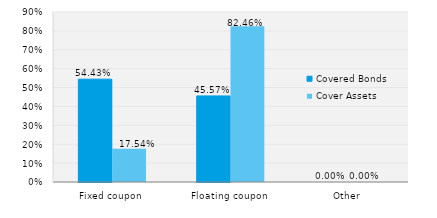
| Category | Covered Bonds | Cover Assets |
|---|---|---|
| Fixed coupon | 0.544 | 0.175 |
| Floating coupon | 0.456 | 0.825 |
| Other | 0 | 0 |